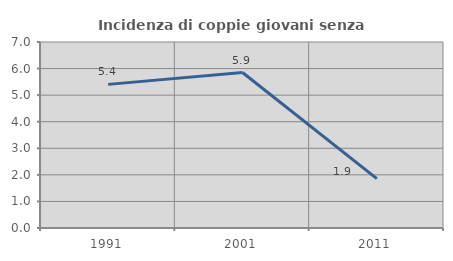
| Category | Incidenza di coppie giovani senza figli |
|---|---|
| 1991.0 | 5.405 |
| 2001.0 | 5.851 |
| 2011.0 | 1.857 |